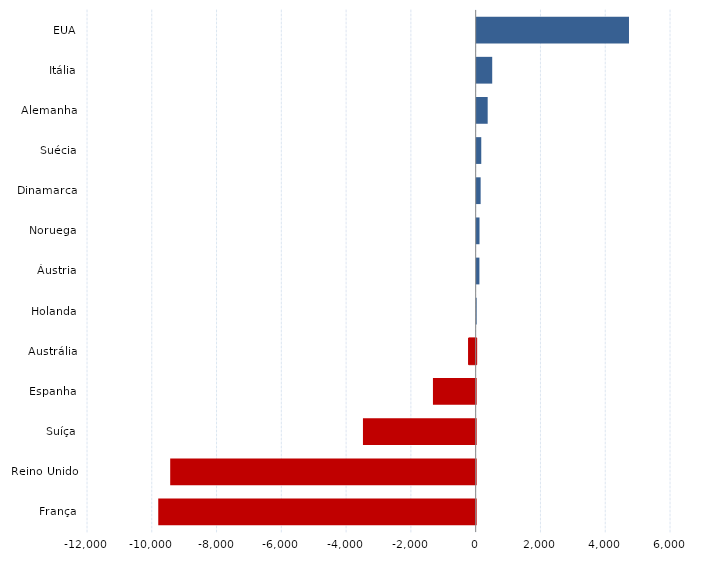
| Category | Series 0 |
|---|---|
| França | -9800 |
| Reino Unido | -9431 |
| Suíça | -3480 |
| Espanha | -1319 |
| Austrália | -230 |
| Holanda | -4 |
| Áustria | 85 |
| Noruega | 88 |
| Dinamarca | 123 |
| Suécia | 142 |
| Alemanha | 340 |
| Itália | 480 |
| EUA | 4703 |